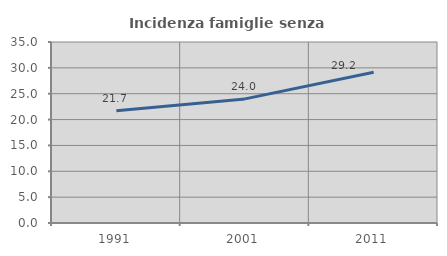
| Category | Incidenza famiglie senza nuclei |
|---|---|
| 1991.0 | 21.701 |
| 2001.0 | 24 |
| 2011.0 | 29.156 |